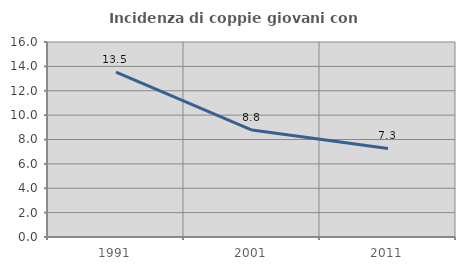
| Category | Incidenza di coppie giovani con figli |
|---|---|
| 1991.0 | 13.527 |
| 2001.0 | 8.779 |
| 2011.0 | 7.262 |